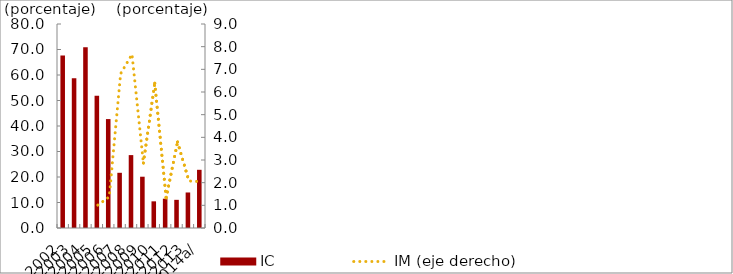
| Category | IC |
|---|---|
| 2002 | 67.62 |
| 2003 | 58.722 |
| 2004 | 70.9 |
| 2005 | 51.819 |
| 2006 | 42.712 |
| 2007 | 21.65 |
| 2008 | 28.585 |
| 2009 | 20.11 |
| 2010 | 10.456 |
| 2011 | 11.485 |
| 2012 | 11.046 |
| 2013 | 13.931 |
| 2014a/ | 22.823 |